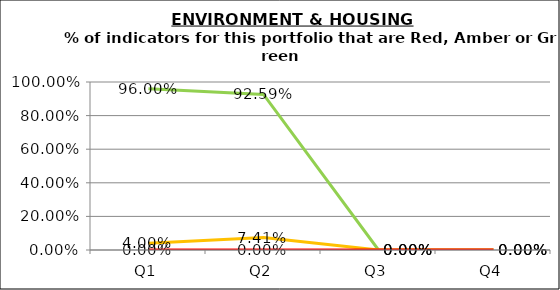
| Category | Green | Amber | Red |
|---|---|---|---|
| Q1 | 0.96 | 0.04 | 0 |
| Q2 | 0.926 | 0.074 | 0 |
| Q3 | 0 | 0 | 0 |
| Q4 | 0 | 0 | 0 |